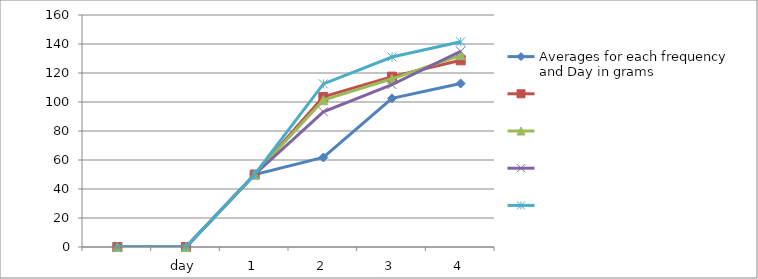
| Category | Averages for each frequency and Day in grams | Series 1 | Series 2 | Series 3 | Series 4 |
|---|---|---|---|---|---|
|  | 0 | 0 | 0 | 0 | 0 |
| day | 0 | 0 | 0 | 0 | 0 |
| 1 | 50 | 50 | 50 | 50 | 50 |
| 2 | 61.75 | 103.5 | 101.25 | 93.25 | 112.5 |
| 3 | 102.5 | 117.5 | 116 | 112 | 131 |
| 4 | 112.75 | 128.75 | 132.25 | 135 | 141.5 |